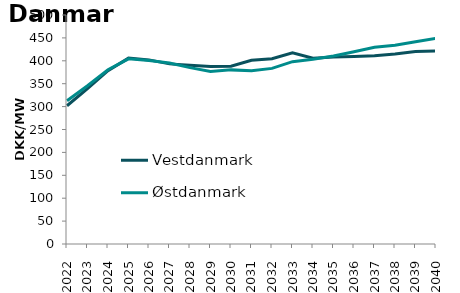
| Category | Vestdanmark | Østdanmark |
|---|---|---|
| 2022.0 | 301.814 | 312.681 |
| 2023.0 | 339.369 | 345.524 |
| 2024.0 | 378.49 | 380.483 |
| 2025.0 | 405.853 | 404.348 |
| 2026.0 | 401.97 | 400.684 |
| 2027.0 | 393.29 | 395.313 |
| 2028.0 | 390.021 | 385.072 |
| 2029.0 | 387.465 | 376.774 |
| 2030.0 | 388.037 | 380.183 |
| 2031.0 | 401.103 | 378.517 |
| 2032.0 | 404.463 | 383.46 |
| 2033.0 | 417.29 | 398.097 |
| 2034.0 | 405.65 | 403.371 |
| 2035.0 | 408.204 | 410.531 |
| 2036.0 | 409.257 | 419.885 |
| 2037.0 | 411.028 | 429.426 |
| 2038.0 | 414.803 | 433.751 |
| 2039.0 | 420.48 | 441.594 |
| 2040.0 | 421.225 | 449.011 |